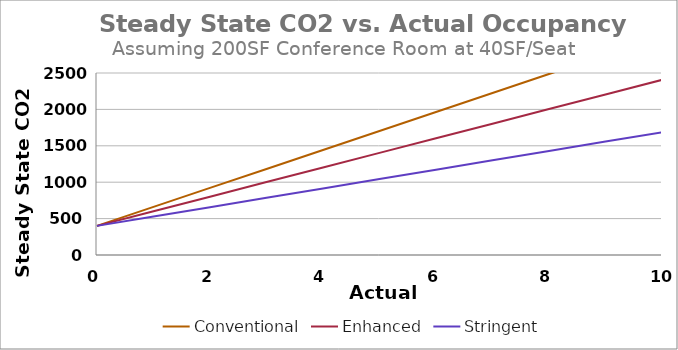
| Category | Conventional | Enhanced | Stringent |
|---|---|---|---|
| 0.0 | 400 | 400 | 400 |
| 1.0 | 660.722 | 600.555 | 528.623 |
| 2.0 | 921.444 | 801.11 | 657.246 |
| 3.0 | 1182.165 | 1001.666 | 785.868 |
| 4.0 | 1442.887 | 1202.221 | 914.491 |
| 5.0 | 1703.609 | 1402.776 | 1043.114 |
| 6.0 | 1964.331 | 1603.331 | 1171.737 |
| 7.0 | 2225.053 | 1803.887 | 1300.359 |
| 8.0 | 2485.775 | 2004.442 | 1428.982 |
| 9.0 | 2746.496 | 2204.997 | 1557.605 |
| 10.0 | 3007.218 | 2405.552 | 1686.228 |